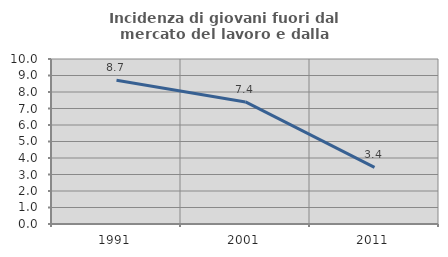
| Category | Incidenza di giovani fuori dal mercato del lavoro e dalla formazione  |
|---|---|
| 1991.0 | 8.709 |
| 2001.0 | 7.397 |
| 2011.0 | 3.436 |